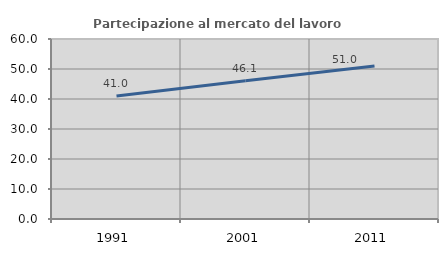
| Category | Partecipazione al mercato del lavoro  femminile |
|---|---|
| 1991.0 | 41.036 |
| 2001.0 | 46.094 |
| 2011.0 | 50.999 |